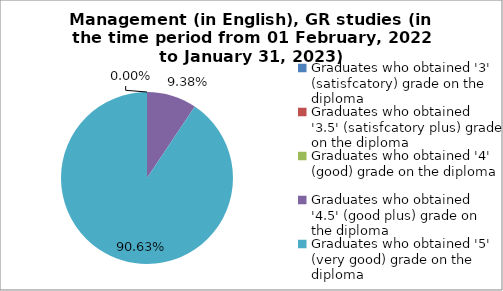
| Category | Series 0 |
|---|---|
| Graduates who obtained '3' (satisfcatory) grade on the diploma  | 0 |
| Graduates who obtained '3.5' (satisfcatory plus) grade on the diploma  | 0 |
| Graduates who obtained '4' (good) grade on the diploma  | 0 |
| Graduates who obtained '4.5' (good plus) grade on the diploma  | 9.375 |
| Graduates who obtained '5' (very good) grade on the diploma  | 90.625 |